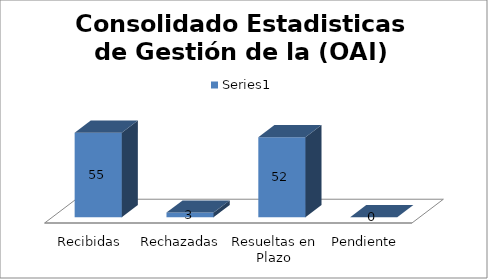
| Category | Series 0 |
|---|---|
| Recibidas | 55 |
| Rechazadas | 3 |
| Resueltas en Plazo | 52 |
| Pendiente | 0 |